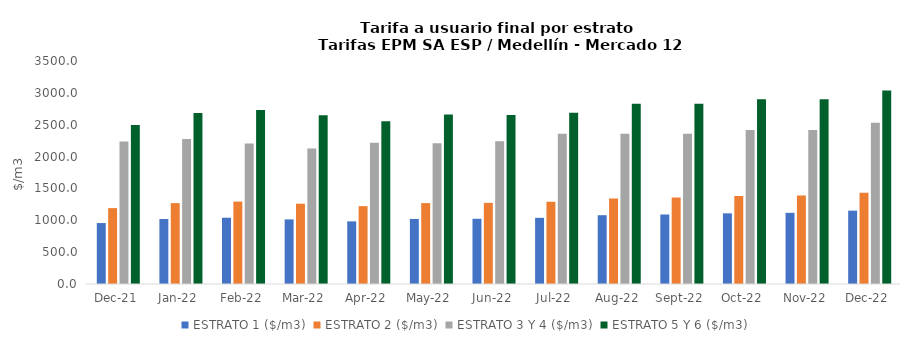
| Category | ESTRATO 1 ($/m3) | ESTRATO 2 ($/m3) | ESTRATO 3 Y 4 ($/m3) | ESTRATO 5 Y 6 ($/m3) |
|---|---|---|---|---|
| 2021-12-01 | 956.83 | 1190.98 | 2235.75 | 2496.192 |
| 2022-01-01 | 1019.7 | 1269.4 | 2276.07 | 2682.9 |
| 2022-02-01 | 1039.99 | 1293.91 | 2206.46 | 2731.284 |
| 2022-03-01 | 1013.84 | 1260.57 | 2127.67 | 2647.752 |
| 2022-04-01 | 982.96 | 1222.1 | 2218.47 | 2553.204 |
| 2022-05-01 | 1021.15 | 1269.88 | 2210.16 | 2662.164 |
| 2022-06-01 | 1023.53 | 1273.16 | 2240.82 | 2652.192 |
| 2022-07-01 | 1038.48 | 1290.79 | 2358.44 | 2688.984 |
| 2022-08-01 | 1079.67 | 1343.67 | 2358.44 | 2830.128 |
| 2022-09-01 | 1090.78 | 1357.5 | 2358.44 | 2830.128 |
| 2022-10-01 | 1109.09 | 1379.51 | 2416.46 | 2899.752 |
| 2022-11-01 | 1117.11 | 1389.55 | 2416.46 | 2899.752 |
| 2022-12-01 | 1151.14 | 1432.98 | 2531.41 | 3037.692 |